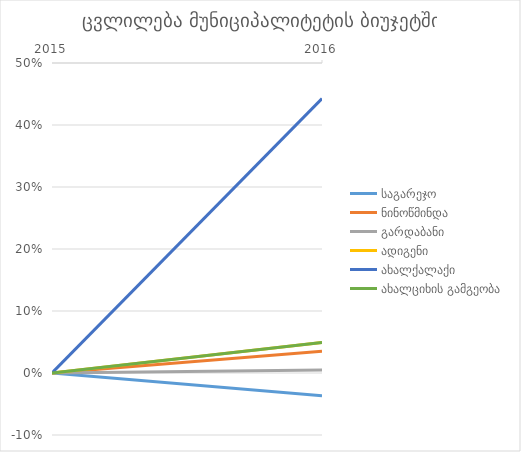
| Category | საგარეჯო | ნინოწმინდა | გარდაბანი | ადიგენი | ახალქალაქი | ახალციხის გამგეობა |
|---|---|---|---|---|---|---|
| 2015.0 | 0 | 0 | 0 | 0 | 0 | 0 |
| 2016.0 | -0.037 | 0.035 | 0.005 | 0.049 | 0.443 | 0.049 |